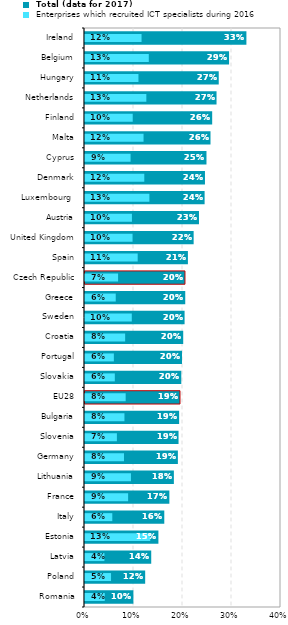
| Category |  Total (data for 2017) |
|---|---|
| Romania | 0.099 |
| Poland | 0.123 |
| Latvia | 0.135 |
| Estonia | 0.15 |
| Italy | 0.162 |
| France | 0.172 |
| Lithuania | 0.181 |
| Germany | 0.19 |
| Slovenia | 0.191 |
| Bulgaria | 0.192 |
| EU28 | 0.194 |
| Slovakia | 0.196 |
| Portugal | 0.198 |
| Croatia | 0.2 |
| Sweden | 0.203 |
| Greece | 0.205 |
| Czech Republic | 0.204 |
| Spain | 0.21 |
| United Kingdom | 0.222 |
| Austria | 0.233 |
| Luxembourg  | 0.244 |
| Denmark | 0.245 |
| Cyprus | 0.248 |
| Malta | 0.256 |
| Finland | 0.26 |
| Netherlands | 0.268 |
| Hungary | 0.273 |
| Belgium | 0.294 |
| Ireland | 0.329 |